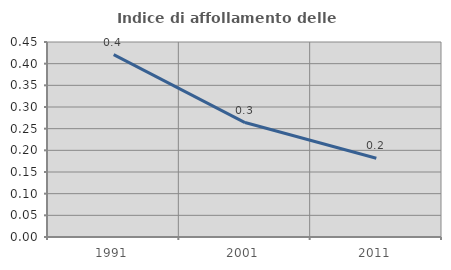
| Category | Indice di affollamento delle abitazioni  |
|---|---|
| 1991.0 | 0.421 |
| 2001.0 | 0.264 |
| 2011.0 | 0.182 |